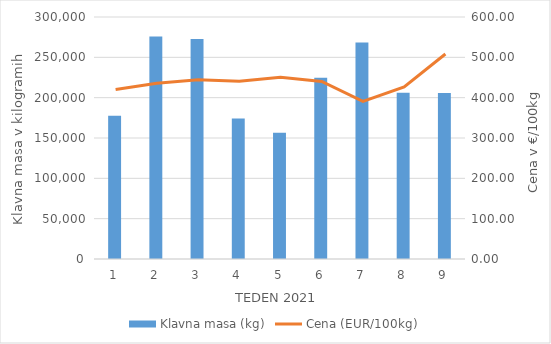
| Category | Klavna masa (kg) |
|---|---|
| 1.0 | 177573 |
| 2.0 | 275951 |
| 3.0 | 272797 |
| 4.0 | 174056 |
| 5.0 | 156508 |
| 6.0 | 224595 |
| 7.0 | 268436 |
| 8.0 | 206193 |
| 9.0 | 205669 |